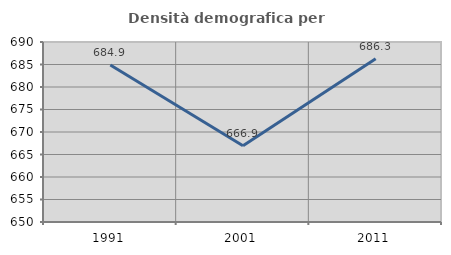
| Category | Densità demografica |
|---|---|
| 1991.0 | 684.894 |
| 2001.0 | 666.943 |
| 2011.0 | 686.275 |